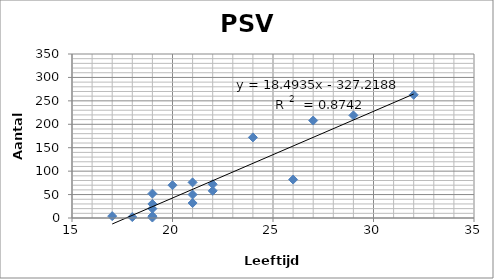
| Category | Series 0 |
|---|---|
| 19.0 | 1 |
| 18.0 | 2 |
| 19.0 | 4 |
| 17.0 | 4 |
| 19.0 | 20 |
| 19.0 | 30 |
| 21.0 | 32 |
| 21.0 | 50 |
| 19.0 | 52 |
| 22.0 | 58 |
| 20.0 | 70 |
| 22.0 | 72 |
| 21.0 | 76 |
| 26.0 | 82 |
| 24.0 | 172 |
| 27.0 | 208 |
| 29.0 | 219 |
| 32.0 | 263 |